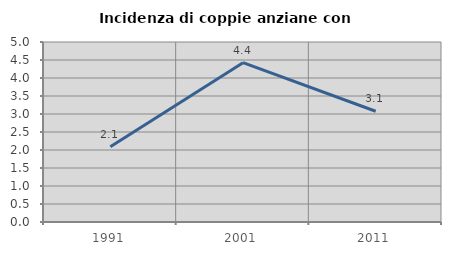
| Category | Incidenza di coppie anziane con figli |
|---|---|
| 1991.0 | 2.092 |
| 2001.0 | 4.425 |
| 2011.0 | 3.077 |